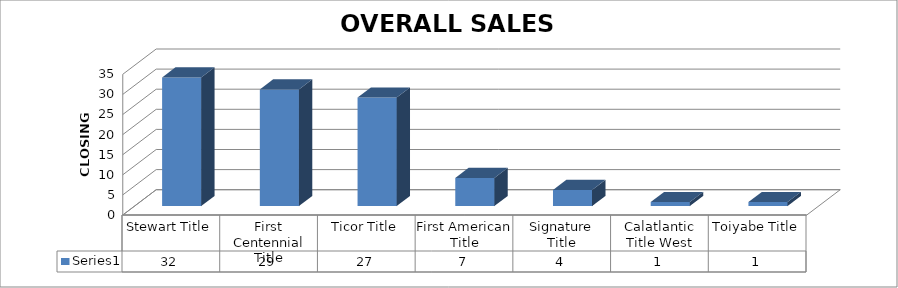
| Category | Series 0 |
|---|---|
| Stewart Title | 32 |
| First Centennial Title | 29 |
| Ticor Title | 27 |
| First American Title | 7 |
| Signature Title | 4 |
| Calatlantic Title West | 1 |
| Toiyabe Title | 1 |